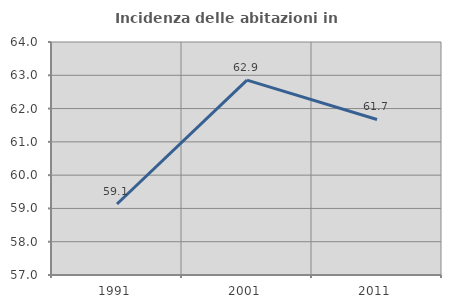
| Category | Incidenza delle abitazioni in proprietà  |
|---|---|
| 1991.0 | 59.133 |
| 2001.0 | 62.853 |
| 2011.0 | 61.672 |